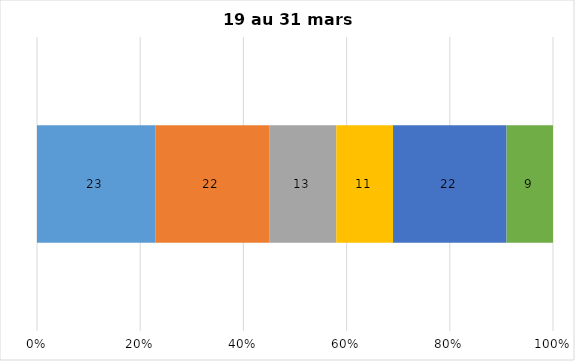
| Category | Plusieurs fois par jour | Une fois par jour | Quelques fois par semaine   | Une fois par semaine ou moins   |  Jamais   |  Je n’utilise pas les médias sociaux |
|---|---|---|---|---|---|---|
| 0 | 23 | 22 | 13 | 11 | 22 | 9 |